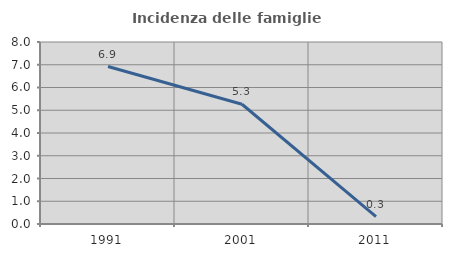
| Category | Incidenza delle famiglie numerose |
|---|---|
| 1991.0 | 6.92 |
| 2001.0 | 5.263 |
| 2011.0 | 0.324 |